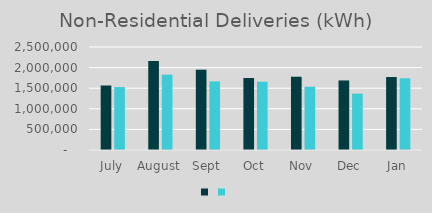
| Category | Series 1 | Series 0 |
|---|---|---|
| July | 1565715 | 1527956 |
| August | 2157982 | 1829758 |
| Sept | 1948950 | 1665239 |
| Oct | 1746850 | 1657467 |
| Nov | 1778480 | 1535448 |
| Dec | 1688051 | 1367905 |
| Jan | 1770828 | 1741151 |